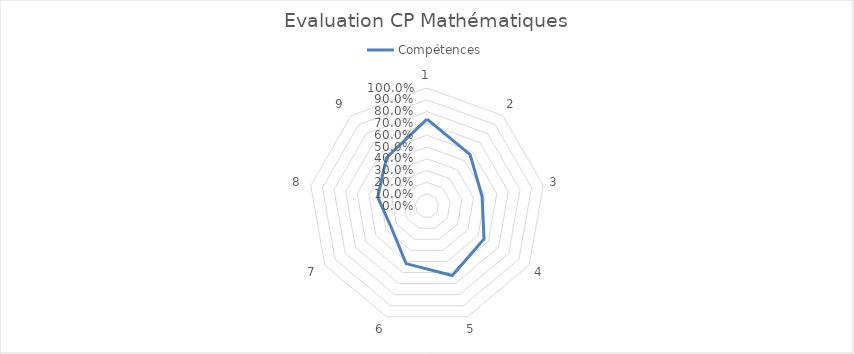
| Category | Compétences |
|---|---|
| 0 | 0.736 |
| 1 | 0.568 |
| 2 | 0.474 |
| 3 | 0.558 |
| 4 | 0.627 |
| 5 | 0.519 |
| 6 | 0.352 |
| 7 | 0.424 |
| 8 | 0.534 |